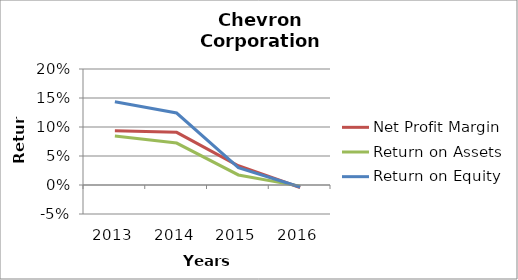
| Category | Net Profit Margin | Return on Assets | Return on Equity |
|---|---|---|---|
| 2013.0 | 0.094 | 0.084 | 0.144 |
| 2014.0 | 0.091 | 0.072 | 0.124 |
| 2015.0 | 0.033 | 0.017 | 0.03 |
| 2016.0 | -0.004 | -0.002 | -0.003 |